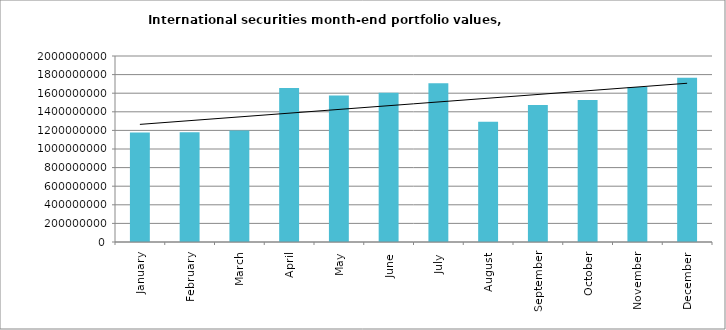
| Category | Series 0 |
|---|---|
| January | 1177439934.9 |
| February | 1179999253.32 |
| March | 1199047139.34 |
| April | 1656027055.36 |
| May | 1576500566.07 |
| June | 1605480021.16 |
| July | 1707587250.81 |
| August | 1293290758.18 |
| September | 1473957318.79 |
| October | 1526081844.7 |
| November | 1667450723.46 |
| December | 1766297478.38 |